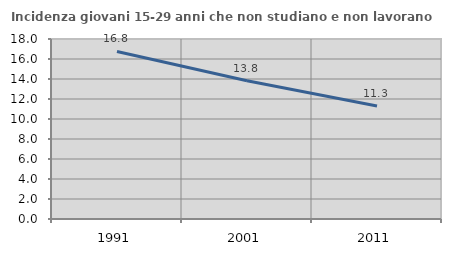
| Category | Incidenza giovani 15-29 anni che non studiano e non lavorano  |
|---|---|
| 1991.0 | 16.756 |
| 2001.0 | 13.817 |
| 2011.0 | 11.299 |